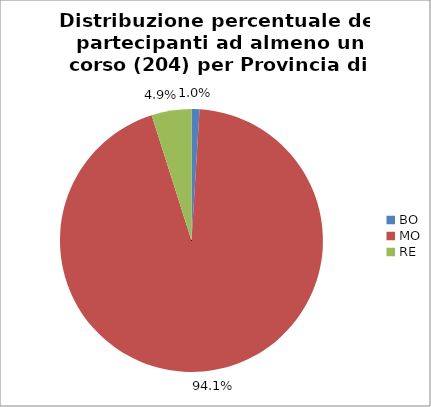
| Category | Nr. Tesserati |
|---|---|
| BO | 2 |
| MO | 192 |
| RE | 10 |